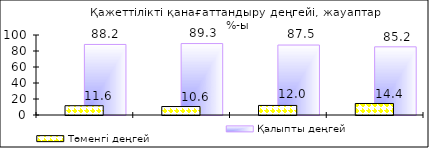
| Category | Білмеймін | Қалыпты деңгей |
|---|---|---|
| 0 | 0.19 | 88.2 |
| 1 | 0.12 | 89.29 |
| 2 | 0.6 | 87.45 |
| 3 | 0.4 | 85.21 |